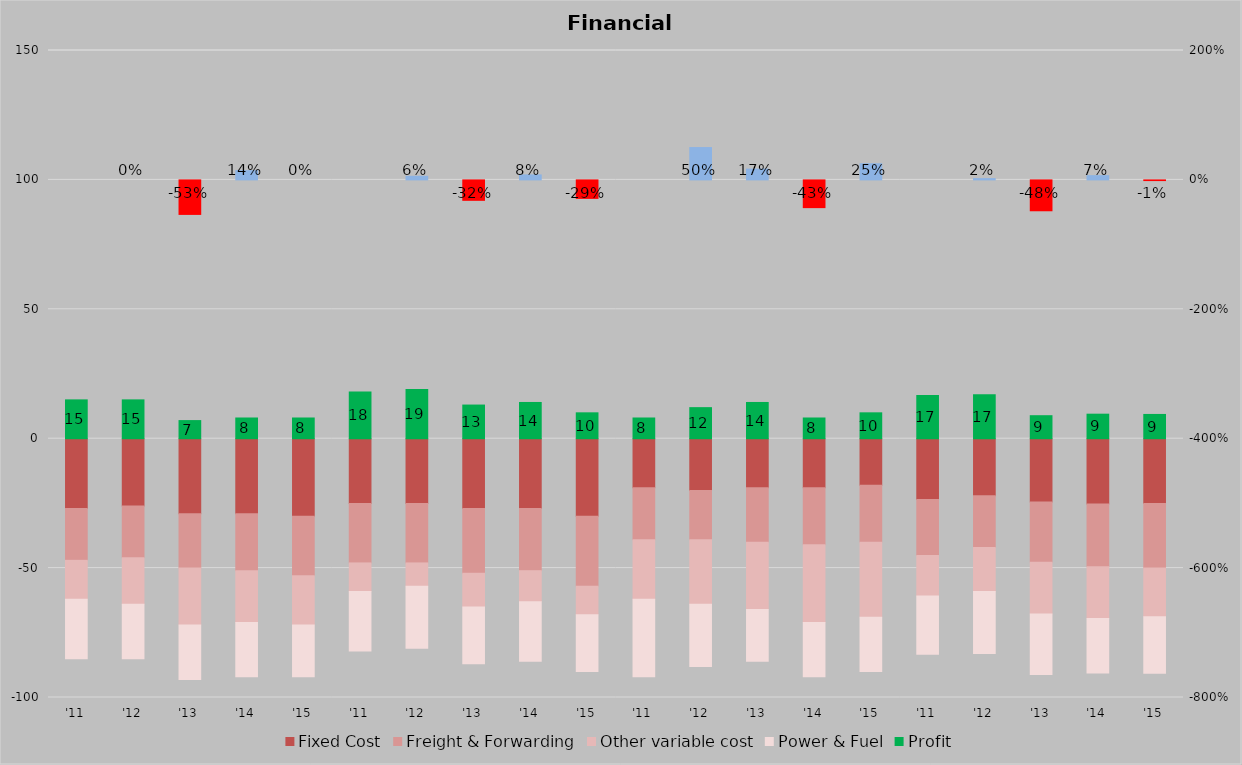
| Category | Fixed Cost | Freight & Forwarding | Other variable cost | Power & Fuel | Profit |
|---|---|---|---|---|---|
| '11 | -27 | -20 | -15 | -23 | 15 |
| '12 | -26 | -20 | -18 | -21 | 15 |
| '13 | -29 | -21 | -22 | -21 | 7 |
| '14 | -29 | -22 | -20 | -21 | 8 |
| '15 | -30 | -23 | -19 | -20 | 8 |
| '11 | -25 | -23 | -11 | -23 | 18 |
| '12 | -25 | -23 | -9 | -24 | 19 |
| '13 | -27 | -25 | -13 | -22 | 13 |
| '14 | -27 | -24 | -12 | -23 | 14 |
| '15 | -30 | -27 | -11 | -22 | 10 |
| '11 | -19 | -20 | -23 | -30 | 8 |
| '12 | -20 | -19 | -25 | -24 | 12 |
| '13 | -19 | -21 | -26 | -20 | 14 |
| '14 | -19 | -22 | -30 | -21 | 8 |
| '15 | -18 | -22 | -29 | -21 | 10 |
| '11 | -23.529 | -21.569 | -15.686 | -22.549 | 16.667 |
| '12 | -22 | -20 | -17 | -24 | 17 |
| '13 | -24.444 | -23.333 | -20 | -23.333 | 8.889 |
| '14 | -25.263 | -24.211 | -20 | -21.053 | 9.474 |
| '15 | -25 | -25 | -18.75 | -21.875 | 9.375 |